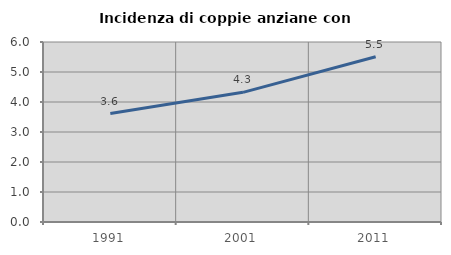
| Category | Incidenza di coppie anziane con figli |
|---|---|
| 1991.0 | 3.613 |
| 2001.0 | 4.322 |
| 2011.0 | 5.506 |